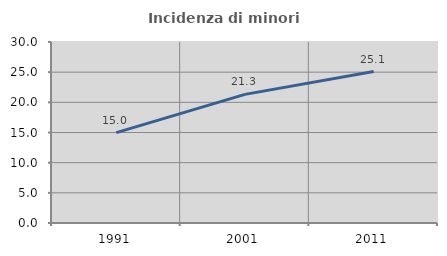
| Category | Incidenza di minori stranieri |
|---|---|
| 1991.0 | 14.976 |
| 2001.0 | 21.32 |
| 2011.0 | 25.095 |